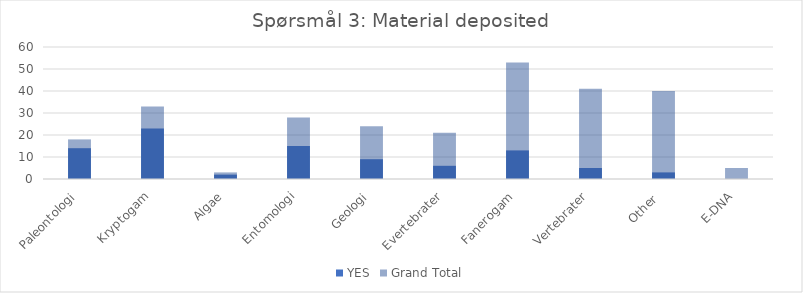
| Category | YES | Grand Total |
|---|---|---|
| Paleontologi | 14 | 18 |
| Kryptogam | 23 | 33 |
| Algae | 2 | 3 |
| Entomologi | 15 | 28 |
| Geologi | 9 | 24 |
| Evertebrater | 6 | 21 |
| Fanerogam | 13 | 53 |
| Vertebrater | 5 | 41 |
| Other  | 3 | 40 |
| E-DNA | 0 | 5 |